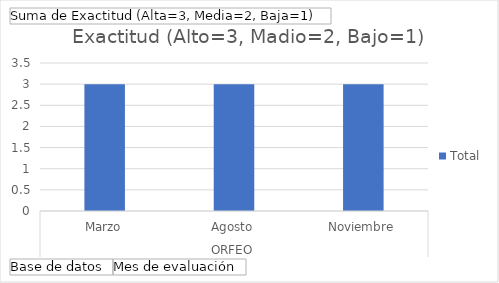
| Category | Total |
|---|---|
| 0 | 3 |
| 1 | 3 |
| 2 | 3 |